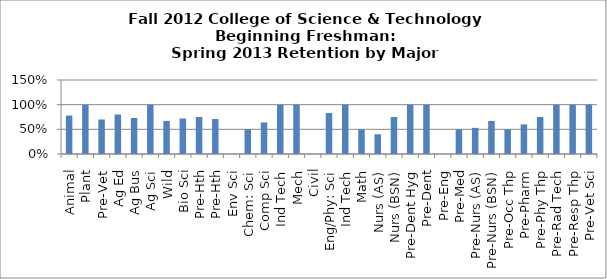
| Category | Series 0 |
|---|---|
| Animal | 0.78 |
| Plant | 1 |
| Pre-Vet | 0.7 |
| Ag Ed | 0.8 |
| Ag Bus | 0.73 |
| Ag Sci | 1 |
| Wild | 0.67 |
| Bio Sci | 0.72 |
| Pre-Hth | 0.75 |
| Pre-Hth | 0.71 |
| Env Sci | 0 |
| Chem: Sci | 0.5 |
| Comp Sci | 0.64 |
| Ind Tech | 1 |
| Mech | 1 |
| Civil | 0 |
| Eng/Phy: Sci | 0.83 |
| Ind Tech | 1 |
| Math | 0.5 |
| Nurs (AS) | 0.4 |
| Nurs (BSN) | 0.75 |
| Pre-Dent Hyg | 1 |
| Pre-Dent | 1 |
| Pre-Eng | 0 |
| Pre-Med | 0.5 |
| Pre-Nurs (AS) | 0.53 |
| Pre-Nurs (BSN) | 0.67 |
| Pre-Occ Thp | 0.5 |
| Pre-Pharm | 0.6 |
| Pre-Phy Thp | 0.75 |
| Pre-Rad Tech | 1 |
| Pre-Resp Thp | 1 |
| Pre-Vet Sci | 1 |